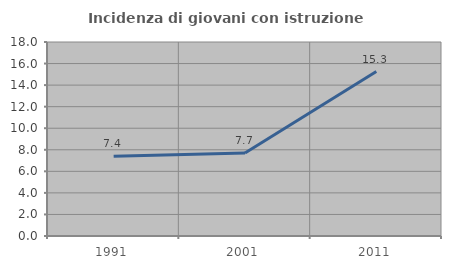
| Category | Incidenza di giovani con istruzione universitaria |
|---|---|
| 1991.0 | 7.407 |
| 2001.0 | 7.692 |
| 2011.0 | 15.254 |